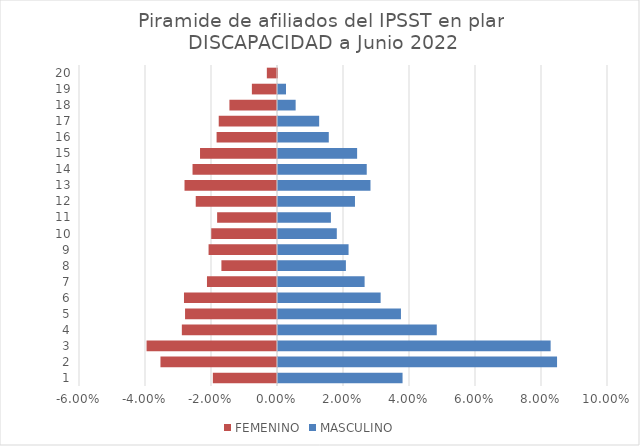
| Category | FEMENINO | MASCULINO |
|---|---|---|
| 0 | -0.019 | 0.038 |
| 1 | -0.035 | 0.085 |
| 2 | -0.04 | 0.083 |
| 3 | -0.029 | 0.048 |
| 4 | -0.028 | 0.037 |
| 5 | -0.028 | 0.031 |
| 6 | -0.021 | 0.026 |
| 7 | -0.017 | 0.021 |
| 8 | -0.021 | 0.021 |
| 9 | -0.02 | 0.018 |
| 10 | -0.018 | 0.016 |
| 11 | -0.025 | 0.023 |
| 12 | -0.028 | 0.028 |
| 13 | -0.026 | 0.027 |
| 14 | -0.023 | 0.024 |
| 15 | -0.018 | 0.015 |
| 16 | -0.018 | 0.012 |
| 17 | -0.014 | 0.005 |
| 18 | -0.008 | 0.002 |
| 19 | -0.003 | 0 |